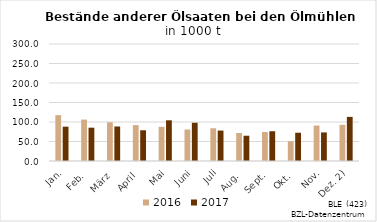
| Category | 2016 | 2017 |
|---|---|---|
| Jan. | 117.483 | 88.062 |
| Feb. | 106.199 | 85.416 |
| März | 99.159 | 88.479 |
| April | 92.059 | 78.788 |
| Mai | 87.637 | 104.366 |
| Juni | 80.769 | 98.078 |
| Juli | 83.892 | 78.064 |
| Aug. | 71.887 | 64.796 |
| Sept. | 74.36 | 76.338 |
| Okt. | 50.704 | 72.498 |
| Nov. | 90.802 | 73.283 |
| Dez. 2) | 92.806 | 113.112 |